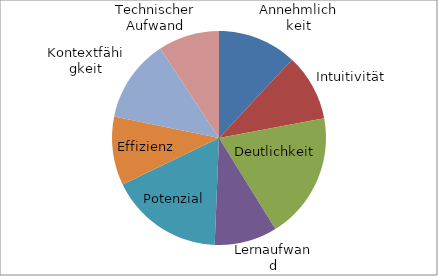
| Category | Series 0 |
|---|---|
| Annehmlichkeit | 11.946 |
| Intuitivität | 10.107 |
| Deutlichkeit | 19.118 |
| Lernaufwand | 9.475 |
| Potenzial | 17.198 |
| Effizienz | 10.362 |
| Kontextfähigkeit | 12.553 |
| Technischer Aufwand | 9.241 |